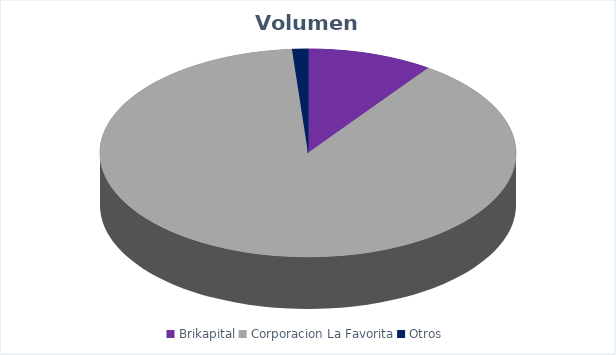
| Category | VOLUMEN ($USD) |
|---|---|
| Brikapital | 13000 |
| Corporacion La Favorita | 118323.13 |
| Otros | 1634 |